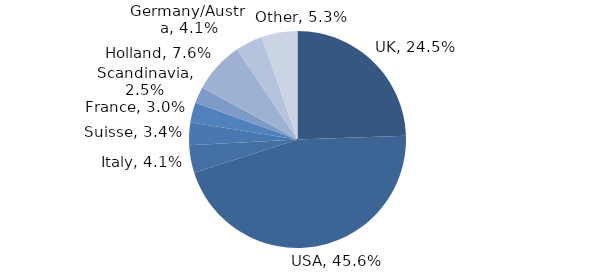
| Category | Investment Style |
|---|---|
| UK | 0.245 |
| USA | 0.456 |
| Italy | 0.041 |
| Suisse | 0.034 |
| France | 0.03 |
| Scandinavia | 0.025 |
| Holland | 0.076 |
| Germany/Austria | 0.041 |
| Other | 0.053 |